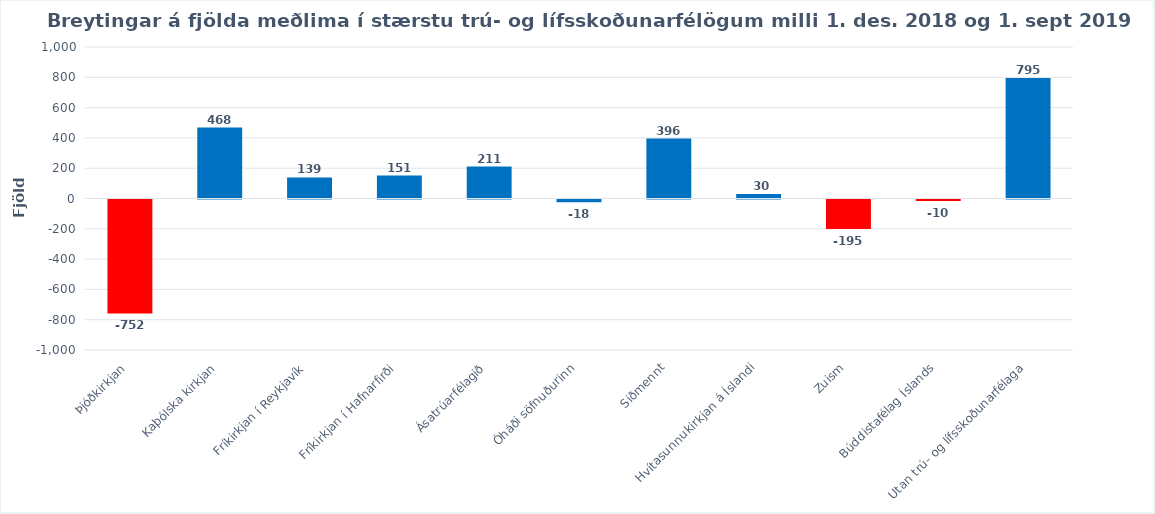
| Category | Series 0 |
|---|---|
| Þjóðkirkjan | -752 |
| Kaþólska kirkjan | 468 |
| Fríkirkjan í Reykjavík | 139 |
| Fríkirkjan í Hafnarfirði | 151 |
| Ásatrúarfélagið | 211 |
| Óháði söfnuðurinn | -18 |
| Siðmennt | 396 |
| Hvítasunnukirkjan á Íslandi | 30 |
| Zuism | -195 |
| Búddistafélag Íslands | -10 |
| Utan trú- og lífsskoðunarfélaga | 795 |